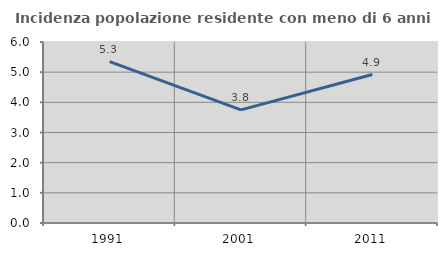
| Category | Incidenza popolazione residente con meno di 6 anni |
|---|---|
| 1991.0 | 5.347 |
| 2001.0 | 3.752 |
| 2011.0 | 4.921 |